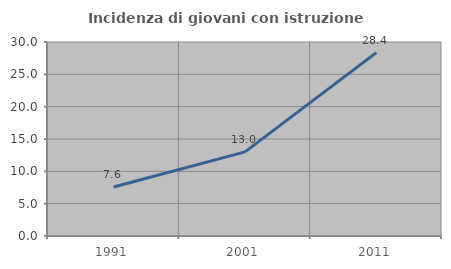
| Category | Incidenza di giovani con istruzione universitaria |
|---|---|
| 1991.0 | 7.581 |
| 2001.0 | 13.008 |
| 2011.0 | 28.365 |